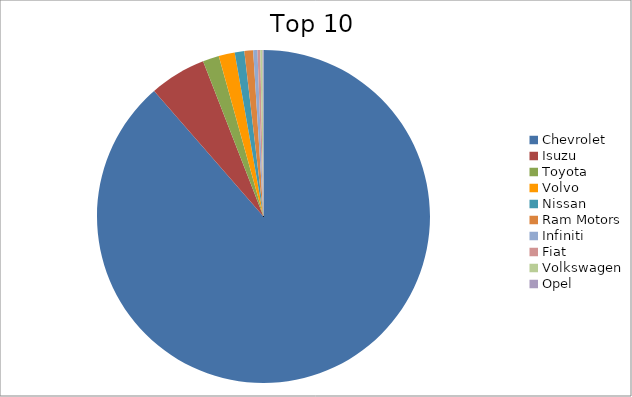
| Category | Series 0 |
|---|---|
| Chevrolet | 88.6 |
| Isuzu | 5.5 |
| Toyota | 1.58 |
| Volvo | 1.56 |
| Nissan | 0.93 |
| Ram Motors | 0.85 |
| Infiniti | 0.41 |
| Fiat | 0.27 |
| Volkswagen | 0.22 |
| Opel | 0.09 |